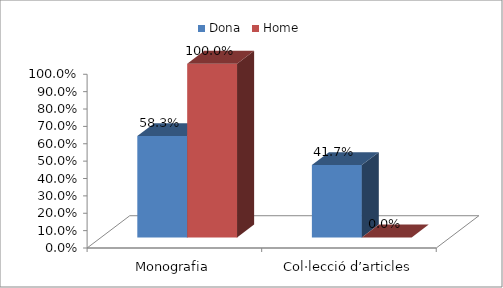
| Category | Dona | Home |
|---|---|---|
| Monografia | 0.583 | 1 |
| Col·lecció d’articles | 0.417 | 0 |